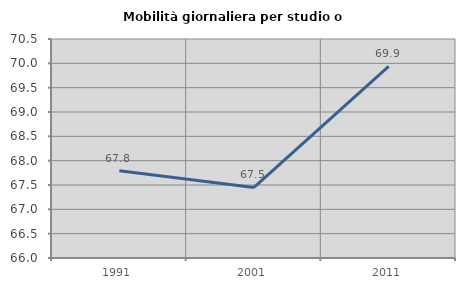
| Category | Mobilità giornaliera per studio o lavoro |
|---|---|
| 1991.0 | 67.791 |
| 2001.0 | 67.451 |
| 2011.0 | 69.937 |